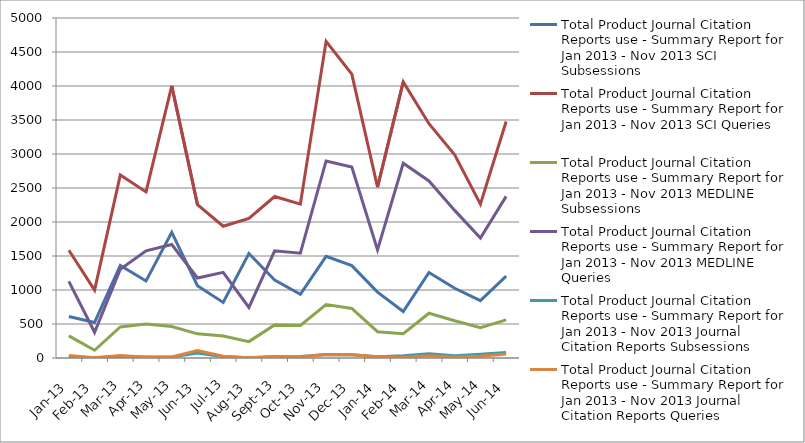
| Category | Total Product Journal Citation Reports use - Summary Report for Jan 2013 - Nov 2013 SCI Subsessions | Total Product Journal Citation Reports use - Summary Report for Jan 2013 - Nov 2013 SCI Queries | Total Product Journal Citation Reports use - Summary Report for Jan 2013 - Nov 2013 MEDLINE Subsessions | Total Product Journal Citation Reports use - Summary Report for Jan 2013 - Nov 2013 MEDLINE Queries | Total Product Journal Citation Reports use - Summary Report for Jan 2013 - Nov 2013 Journal Citation Reports Subsessions | Total Product Journal Citation Reports use - Summary Report for Jan 2013 - Nov 2013 Journal Citation Reports Queries |
|---|---|---|---|---|---|---|
| 2013-01-01 | 610 | 1584 | 326 | 1127 | 18 | 37 |
| 2013-02-01 | 523 | 999 | 114 | 378 | 5 | 4 |
| 2013-03-01 | 1360 | 2691 | 456 | 1306 | 26 | 38 |
| 2013-04-01 | 1133 | 2442 | 499 | 1577 | 15 | 12 |
| 2013-05-01 | 1849 | 4002 | 463 | 1669 | 16 | 16 |
| 2013-06-01 | 1064 | 2255 | 355 | 1177 | 73 | 110 |
| 2013-07-01 | 817 | 1938 | 322 | 1260 | 19 | 26 |
| 2013-08-01 | 1536 | 2052 | 241 | 743 | 3 | 3 |
| 2013-09-01 | 1148 | 2375 | 487 | 1577 | 19 | 23 |
| 2013-10-01 | 937 | 2262 | 479 | 1541 | 22 | 13 |
| 2013-11-01 | 1495 | 4657 | 786 | 2898 | 51 | 51 |
| 2013-12-01 | 1359 | 4174 | 729 | 2809 | 46 | 48 |
| 2014-01-01 | 969 | 2513 | 387 | 1589 | 18 | 20 |
| 2014-02-01 | 684 | 4061 | 357 | 2864 | 32 | 9 |
| 2014-03-01 | 1258 | 3445 | 658 | 2603 | 63 | 34 |
| 2014-04-01 | 1026 | 2988 | 547 | 2171 | 34 | 13 |
| 2014-05-01 | 844 | 2262 | 447 | 1765 | 54 | 24 |
| 2014-06-01 | 1203 | 3478 | 560 | 2377 | 80 | 58 |